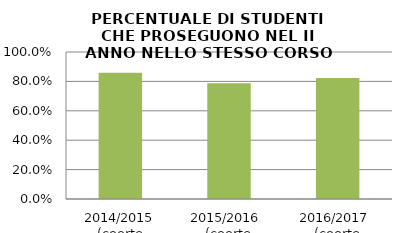
| Category | 2014/2015 (coorte 2013/14) 2015/2016  (coorte 2014/15) 2016/2017  (coorte 2015/16) |
|---|---|
| 2014/2015 (coorte 2013/14) | 0.859 |
| 2015/2016  (coorte 2014/15) | 0.787 |
| 2016/2017  (coorte 2015/16) | 0.823 |